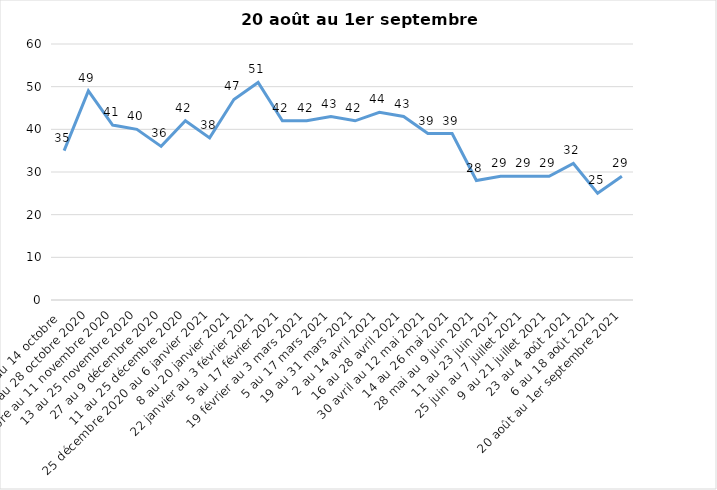
| Category | Toujours aux trois mesures |
|---|---|
| 2 au 14 octobre  | 35 |
| 16 au 28 octobre 2020 | 49 |
| 30 octobre au 11 novembre 2020 | 41 |
| 13 au 25 novembre 2020 | 40 |
| 27 au 9 décembre 2020 | 36 |
| 11 au 25 décembre 2020 | 42 |
| 25 décembre 2020 au 6 janvier 2021 | 38 |
| 8 au 20 janvier 2021 | 47 |
| 22 janvier au 3 février 2021 | 51 |
| 5 au 17 février 2021 | 42 |
| 19 février au 3 mars 2021 | 42 |
| 5 au 17 mars 2021 | 43 |
| 19 au 31 mars 2021 | 42 |
| 2 au 14 avril 2021 | 44 |
| 16 au 28 avril 2021 | 43 |
| 30 avril au 12 mai 2021 | 39 |
| 14 au 26 mai 2021 | 39 |
| 28 mai au 9 juin 2021 | 28 |
| 11 au 23 juin 2021 | 29 |
| 25 juin au 7 juillet 2021 | 29 |
| 9 au 21 juillet 2021 | 29 |
| 23 au 4 août 2021 | 32 |
| 6 au 18 août 2021 | 25 |
| 20 août au 1er septembre 2021 | 29 |